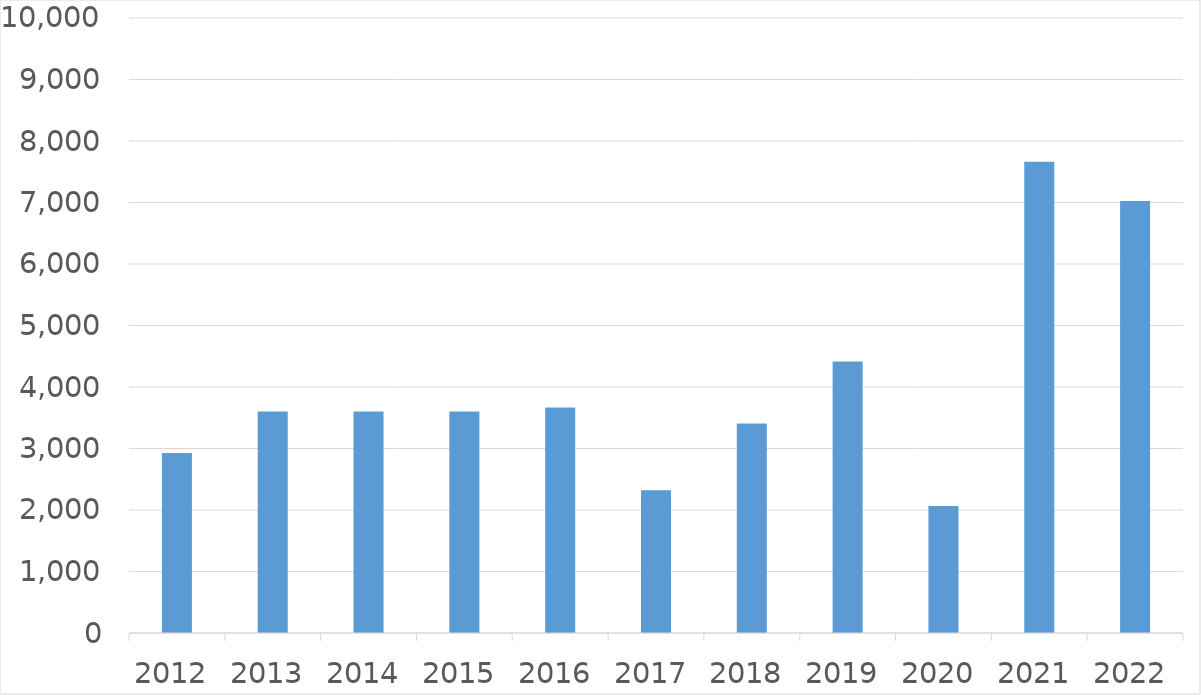
| Category | Series 0 |
|---|---|
| 2012 | 2925 |
| 2013 | 3600 |
| 2014 | 3600 |
| 2015 | 3600 |
| 2016 | 3666 |
| 2017 | 2320 |
| 2018 | 3406 |
| 2019 | 4413 |
| 2020 | 2065 |
| 2021 | 7664 |
| 2022 | 7023 |